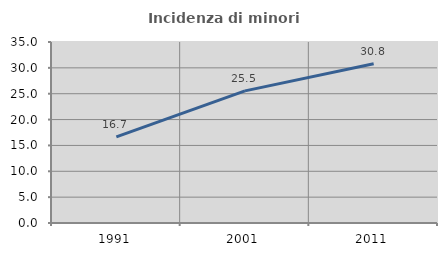
| Category | Incidenza di minori stranieri |
|---|---|
| 1991.0 | 16.667 |
| 2001.0 | 25.547 |
| 2011.0 | 30.8 |